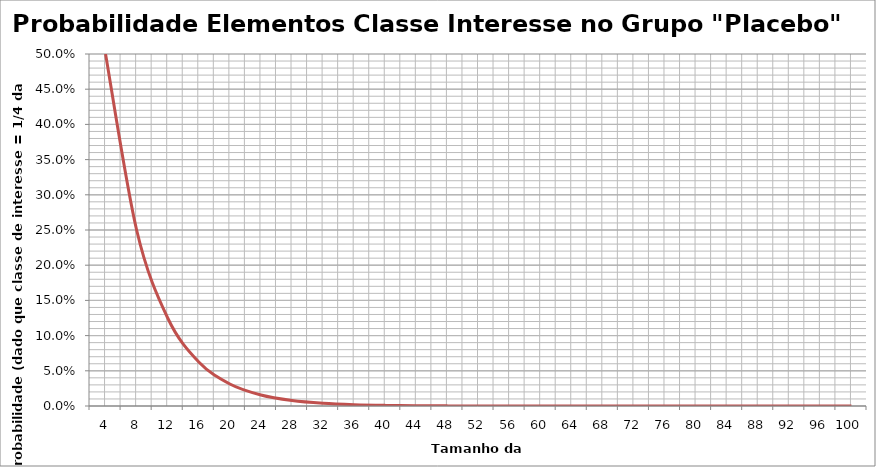
| Category | Probabilidade Elementos Classe Interesse no Grupo "Placebo" |
|---|---|
| 4.0 | 0.5 |
| 8.0 | 0.25 |
| 12.0 | 0.125 |
| 16.0 | 0.062 |
| 20.0 | 0.031 |
| 24.0 | 0.016 |
| 28.0 | 0.008 |
| 32.0 | 0.004 |
| 36.0 | 0.002 |
| 40.0 | 0.001 |
| 44.0 | 0 |
| 48.0 | 0 |
| 52.0 | 0 |
| 56.0 | 0 |
| 60.0 | 0 |
| 64.0 | 0 |
| 68.0 | 0 |
| 72.0 | 0 |
| 76.0 | 0 |
| 80.0 | 0 |
| 84.0 | 0 |
| 88.0 | 0 |
| 92.0 | 0 |
| 96.0 | 0 |
| 100.0 | 0 |